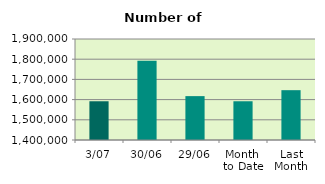
| Category | Series 0 |
|---|---|
| 3/07 | 1591772 |
| 30/06 | 1792482 |
| 29/06 | 1617190 |
| Month 
to Date | 1591772 |
| Last
Month | 1646651.818 |